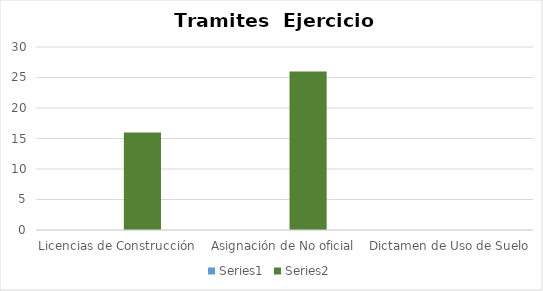
| Category | Series 0 | Series 1 |
|---|---|---|
| Licencias de Construcción |  | 16 |
| Asignación de No oficial |  | 26 |
| Dictamen de Uso de Suelo |  | 0 |